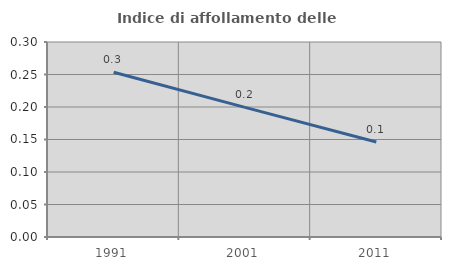
| Category | Indice di affollamento delle abitazioni  |
|---|---|
| 1991.0 | 0.254 |
| 2001.0 | 0.199 |
| 2011.0 | 0.146 |